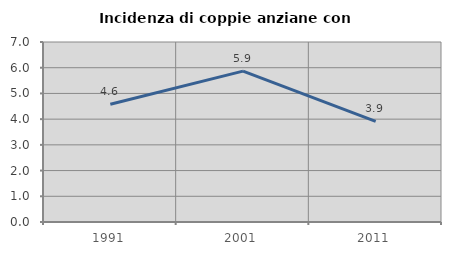
| Category | Incidenza di coppie anziane con figli |
|---|---|
| 1991.0 | 4.577 |
| 2001.0 | 5.868 |
| 2011.0 | 3.911 |